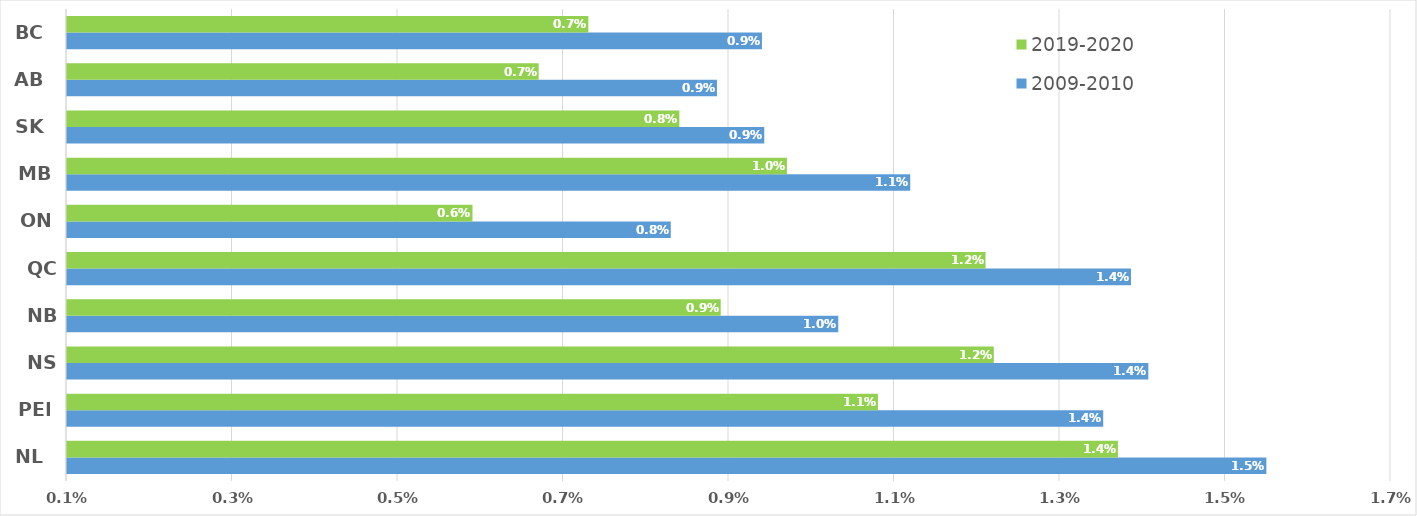
| Category | 2009-2010 | 2019-2020 |
|---|---|---|
| NL | 0.015 | 0.014 |
| PEI | 0.014 | 0.011 |
| NS | 0.014 | 0.012 |
| NB | 0.01 | 0.009 |
| QC | 0.014 | 0.012 |
| ON | 0.008 | 0.006 |
| MB | 0.011 | 0.01 |
| SK | 0.009 | 0.008 |
| AB | 0.009 | 0.007 |
| BC | 0.009 | 0.007 |